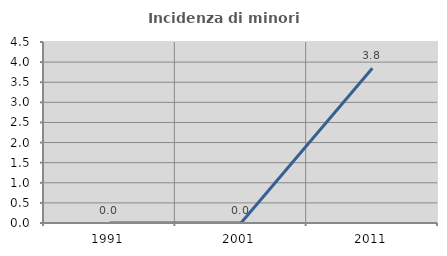
| Category | Incidenza di minori stranieri |
|---|---|
| 1991.0 | 0 |
| 2001.0 | 0 |
| 2011.0 | 3.846 |